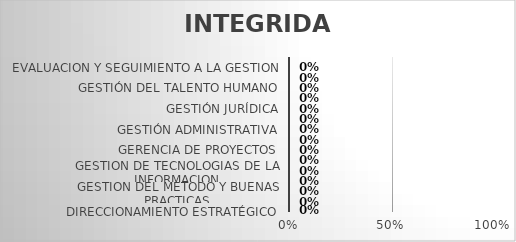
| Category | INTEGRIDAD |
|---|---|
| DIRECCIONAMIENTO ESTRATÉGICO | 0 |
| GESTIÓN DE PROVEEDORES | 0 |
| GESTION DEL METODO Y BUENAS PRACTICAS | 0 |
| GESTION DE COMUNICACIONES | 0 |
| GESTION DE TECNOLOGIAS DE LA INFORMACION | 0 |
| ESTRUCTURACION DE PROYECTOS | 0 |
| GERENCIA DE PROYECTOS | 0 |
| EVALUACION DE PROYECTOS | 0 |
| GESTIÓN ADMINISTRATIVA | 0 |
| GESTIÓN DEL RIESGO | 0 |
| GESTIÓN JURÍDICA | 0 |
| GESTIÓN FINANCIERA | 0 |
| GESTIÓN DEL TALENTO HUMANO | 0 |
| AUDITORIA INTERNA | 0 |
| EVALUACION Y SEGUIMIENTO A LA GESTION | 0 |